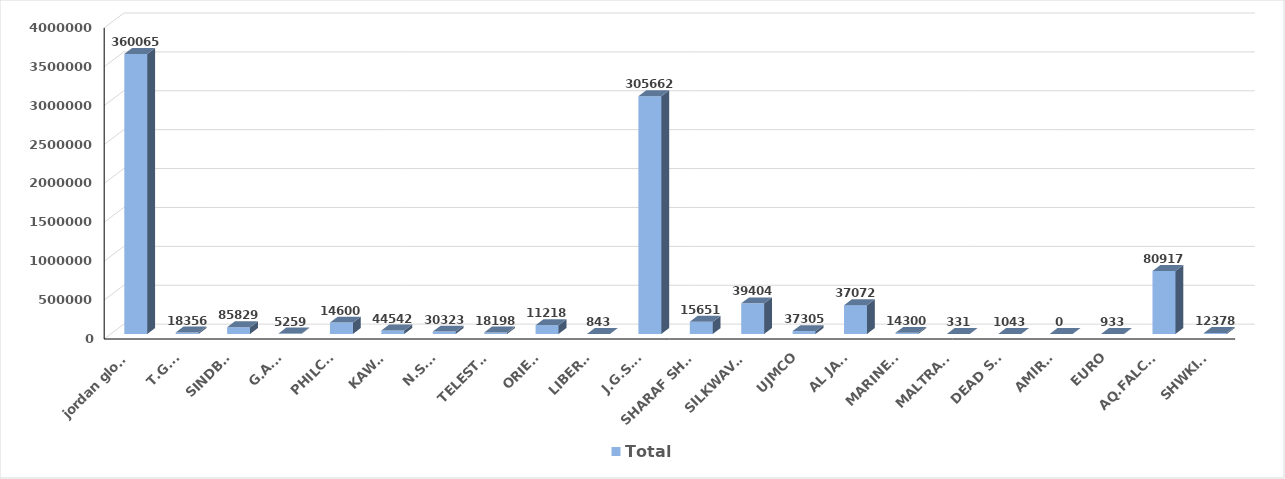
| Category | Total |
|---|---|
| jordan global | 3600659 |
| T.G.F. | 18356 |
| SINDBAD | 85829 |
| G.A.C. | 5259 |
| PHILCO | 146000 |
| KAWAR | 44542 |
| N.S.S. | 30323 |
| TELESTAR | 18198 |
| ORIENT | 112180 |
| LIBERTY | 843 |
| J.G.S.A. | 3056624 |
| SHARAF SHG. | 156512 |
| SILKWAVES | 394045 |
| UJMCO | 37305 |
| AL JAZI | 370723 |
| MARINERS | 14300 |
| MALTRANS | 331 |
| DEAD SEA | 1043 |
| AMIRAL | 0 |
| EURO | 933 |
| AQ.FALCON | 809177 |
| SHWKINI | 12378 |